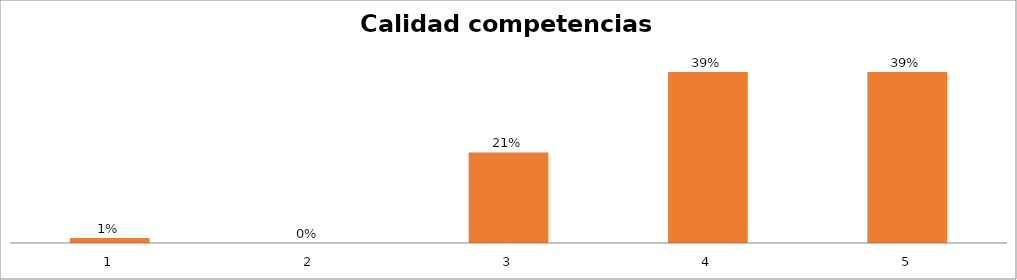
| Category | Series 1 |
|---|---|
| 0 | 0.011 |
| 1 | 0 |
| 2 | 0.207 |
| 3 | 0.391 |
| 4 | 0.391 |